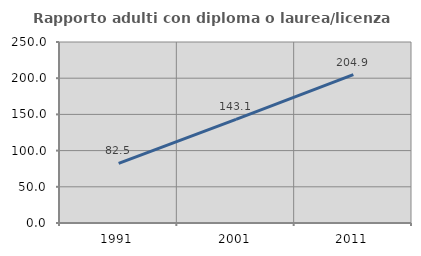
| Category | Rapporto adulti con diploma o laurea/licenza media  |
|---|---|
| 1991.0 | 82.456 |
| 2001.0 | 143.051 |
| 2011.0 | 204.851 |